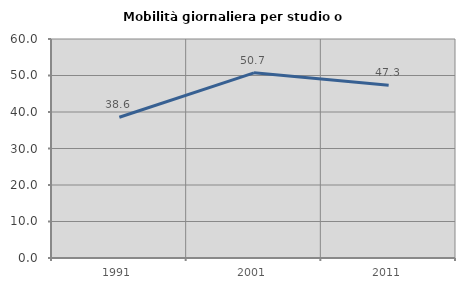
| Category | Mobilità giornaliera per studio o lavoro |
|---|---|
| 1991.0 | 38.563 |
| 2001.0 | 50.725 |
| 2011.0 | 47.336 |